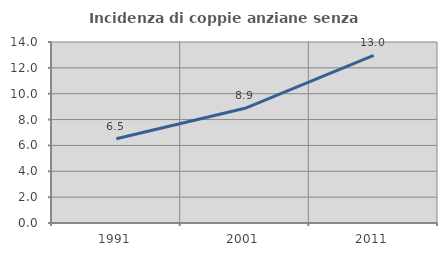
| Category | Incidenza di coppie anziane senza figli  |
|---|---|
| 1991.0 | 6.517 |
| 2001.0 | 8.875 |
| 2011.0 | 12.961 |